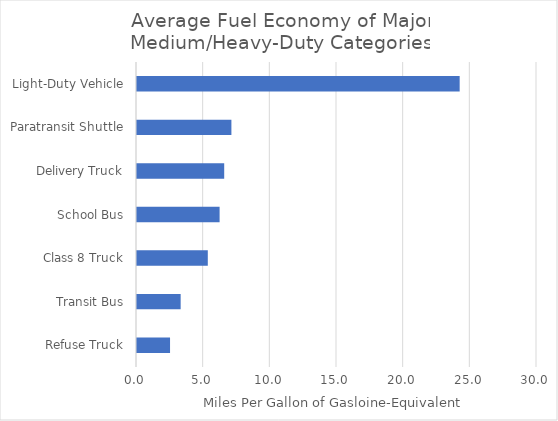
| Category | MPG Gasoline |
|---|---|
| Refuse Truck | 2.478 |
| Transit Bus | 3.274 |
| Class 8 Truck | 5.31 |
| School Bus | 6.195 |
| Delivery Truck | 6.54 |
| Paratransit Shuttle | 7.08 |
| Light-Duty Vehicle | 24.2 |